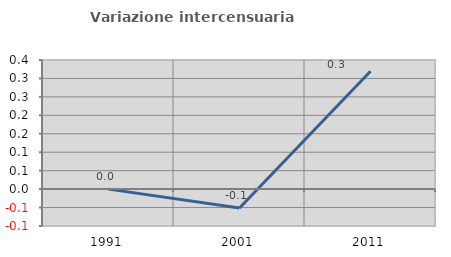
| Category | Variazione intercensuaria annua |
|---|---|
| 1991.0 | 0 |
| 2001.0 | -0.051 |
| 2011.0 | 0.32 |